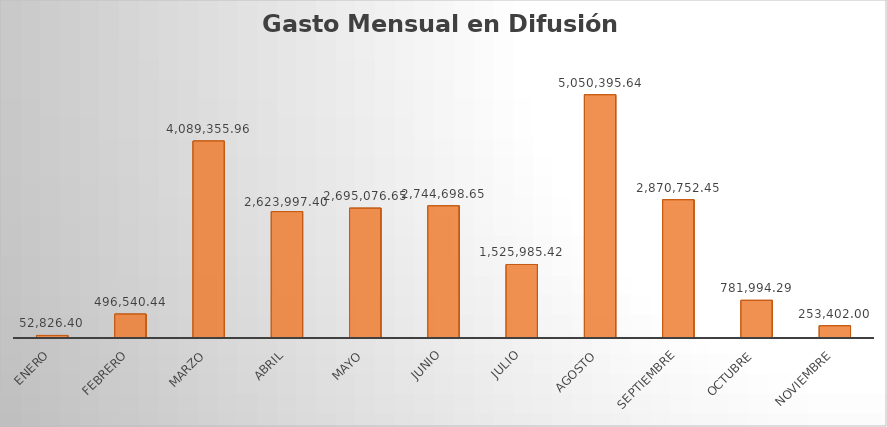
| Category | Monto |
|---|---|
| ENERO | 52826.4 |
| FEBRERO | 496540.44 |
| MARZO | 4089355.96 |
| ABRIL | 2623997.4 |
| MAYO | 2695076.65 |
| JUNIO | 2744698.65 |
| JULIO | 1525985.42 |
| AGOSTO | 5050395.64 |
| SEPTIEMBRE | 2870752.45 |
| OCTUBRE | 781994.29 |
| NOVIEMBRE | 253402 |